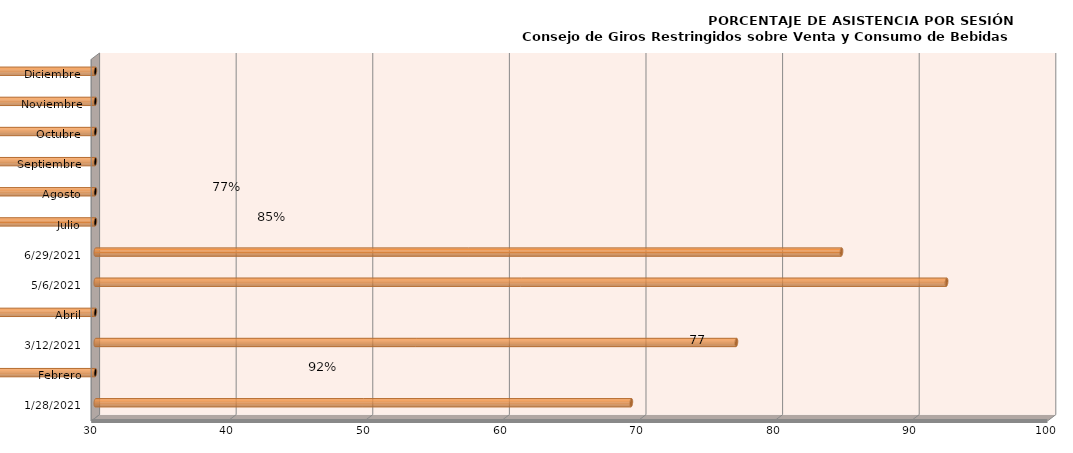
| Category | Series 0 |
|---|---|
| 28/01/2021 | 69.231 |
| Febrero | 0 |
| 12/03/2021 | 76.923 |
| Abril | 0 |
| 06/05/2021 | 92.308 |
| 29/06/2021 | 84.615 |
| Julio | 0 |
| Agosto | 0 |
| Septiembre | 0 |
| Octubre | 0 |
| Noviembre | 0 |
| Diciembre | 0 |